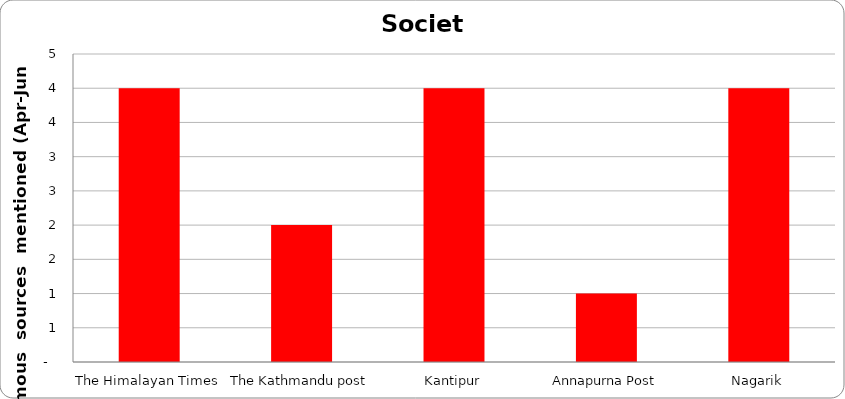
| Category | Society |
|---|---|
| The Himalayan Times | 4 |
| The Kathmandu post | 2 |
| Kantipur | 4 |
| Annapurna Post | 1 |
| Nagarik | 4 |